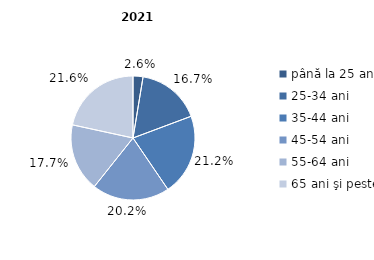
| Category | Series 0 |
|---|---|
| până la 25 ani | 2.6 |
| 25-34 ani | 16.7 |
| 35-44 ani | 21.2 |
| 45-54 ani | 20.2 |
| 55-64 ani | 17.7 |
| 65 ani şi peste | 21.6 |